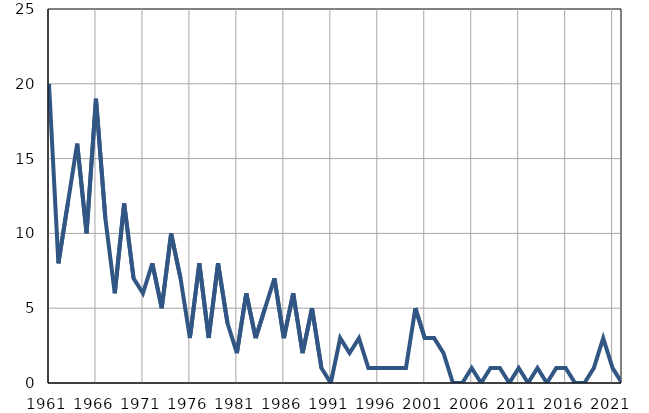
| Category | Умрла 
одојчад |
|---|---|
| 1961.0 | 20 |
| 1962.0 | 8 |
| 1963.0 | 12 |
| 1964.0 | 16 |
| 1965.0 | 10 |
| 1966.0 | 19 |
| 1967.0 | 11 |
| 1968.0 | 6 |
| 1969.0 | 12 |
| 1970.0 | 7 |
| 1971.0 | 6 |
| 1972.0 | 8 |
| 1973.0 | 5 |
| 1974.0 | 10 |
| 1975.0 | 7 |
| 1976.0 | 3 |
| 1977.0 | 8 |
| 1978.0 | 3 |
| 1979.0 | 8 |
| 1980.0 | 4 |
| 1981.0 | 2 |
| 1982.0 | 6 |
| 1983.0 | 3 |
| 1984.0 | 5 |
| 1985.0 | 7 |
| 1986.0 | 3 |
| 1987.0 | 6 |
| 1988.0 | 2 |
| 1989.0 | 5 |
| 1990.0 | 1 |
| 1991.0 | 0 |
| 1992.0 | 3 |
| 1993.0 | 2 |
| 1994.0 | 3 |
| 1995.0 | 1 |
| 1996.0 | 1 |
| 1997.0 | 1 |
| 1998.0 | 1 |
| 1999.0 | 1 |
| 2000.0 | 5 |
| 2001.0 | 3 |
| 2002.0 | 3 |
| 2003.0 | 2 |
| 2004.0 | 0 |
| 2005.0 | 0 |
| 2006.0 | 1 |
| 2007.0 | 0 |
| 2008.0 | 1 |
| 2009.0 | 1 |
| 2010.0 | 0 |
| 2011.0 | 1 |
| 2012.0 | 0 |
| 2013.0 | 1 |
| 2014.0 | 0 |
| 2015.0 | 1 |
| 2016.0 | 1 |
| 2017.0 | 0 |
| 2018.0 | 0 |
| 2019.0 | 1 |
| 2020.0 | 3 |
| 2021.0 | 1 |
| 2022.0 | 0 |